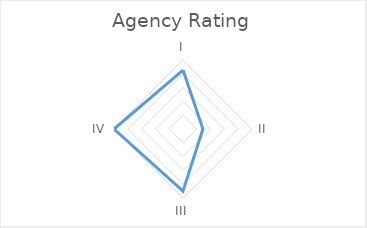
| Category | Series 0 |
|---|---|
| I | 2.727 |
| II | 2.444 |
| III | 2.75 |
| IV | 2.8 |